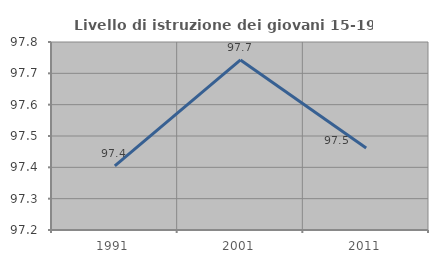
| Category | Livello di istruzione dei giovani 15-19 anni |
|---|---|
| 1991.0 | 97.405 |
| 2001.0 | 97.743 |
| 2011.0 | 97.462 |